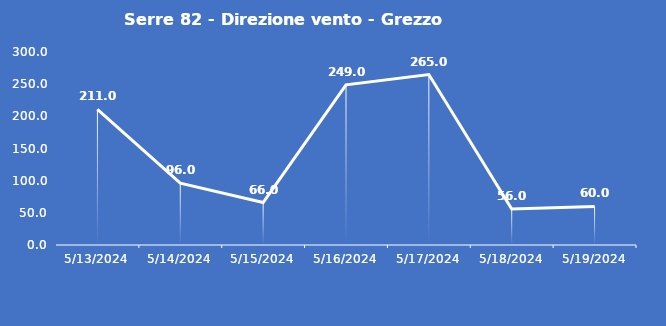
| Category | Serre 82 - Direzione vento - Grezzo (°N) |
|---|---|
| 5/13/24 | 211 |
| 5/14/24 | 96 |
| 5/15/24 | 66 |
| 5/16/24 | 249 |
| 5/17/24 | 265 |
| 5/18/24 | 56 |
| 5/19/24 | 60 |